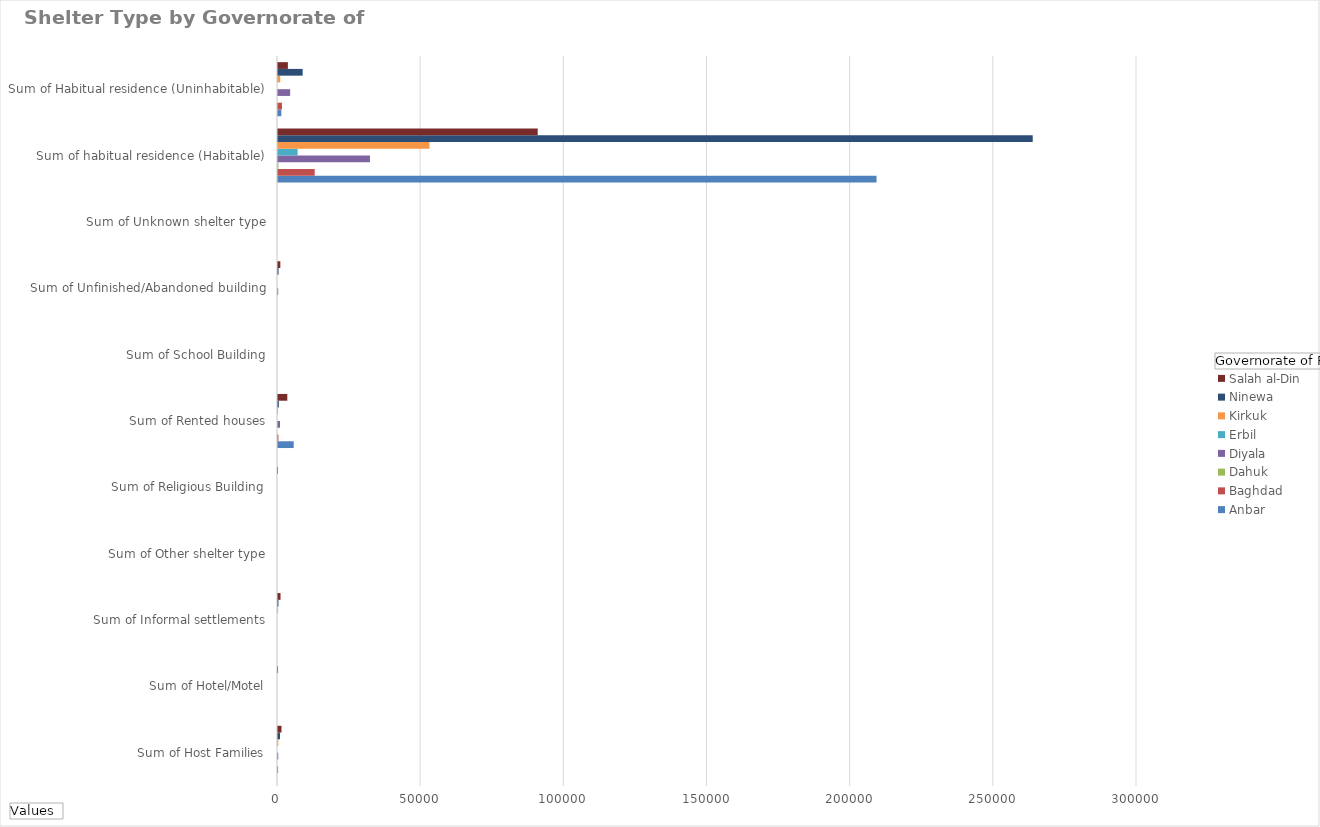
| Category | Anbar | Baghdad | Dahuk | Diyala | Erbil | Kirkuk | Ninewa | Salah al-Din |
|---|---|---|---|---|---|---|---|---|
| Sum of Host Families | 0 | 34 | 0 | 94 | 0 | 110 | 704 | 1214 |
| Sum of Hotel/Motel | 0 | 0 | 0 | 0 | 0 | 0 | 17 | 0 |
| Sum of Informal settlements | 0 | 0 | 0 | 0 | 0 | 44 | 159 | 882 |
| Sum of Other shelter type | 0 | 0 | 0 | 0 | 0 | 0 | 0 | 0 |
| Sum of Religious Building | 0 | 0 | 0 | 0 | 0 | 0 | 1 | 0 |
| Sum of Rented houses | 5484 | 152 | 0 | 692 | 0 | 30 | 283 | 3249 |
| Sum of School Building | 0 | 0 | 0 | 0 | 0 | 0 | 0 | 0 |
| Sum of Unfinished/Abandoned building | 0 | 0 | 0 | 67 | 0 | 0 | 193 | 811 |
| Sum of Unknown shelter type | 0 | 0 | 0 | 0 | 0 | 0 | 0 | 0 |
| Sum of habitual residence (Habitable) | 209032 | 12817 | 130 | 32122 | 6860 | 52893 | 263582 | 90704 |
| Sum of Habitual residence (Uninhabitable) | 1160 | 1399 | 0 | 4246 | 0 | 770 | 8611 | 3451 |